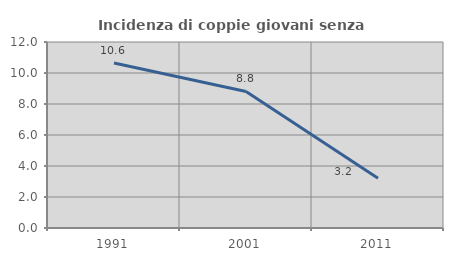
| Category | Incidenza di coppie giovani senza figli |
|---|---|
| 1991.0 | 10.648 |
| 2001.0 | 8.812 |
| 2011.0 | 3.215 |